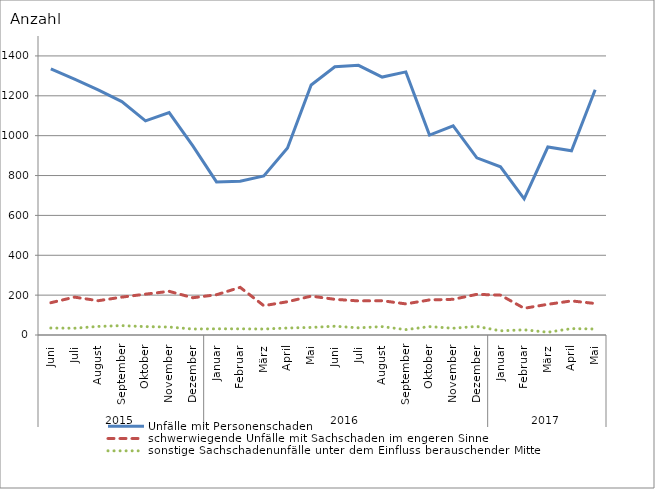
| Category | Unfälle mit Personenschaden | schwerwiegende Unfälle mit Sachschaden im engeren Sinne | sonstige Sachschadenunfälle unter dem Einfluss berauschender Mittel |
|---|---|---|---|
| 0 | 1335 | 162 | 35 |
| 1 | 1284 | 190 | 34 |
| 2 | 1230 | 172 | 43 |
| 3 | 1171 | 190 | 47 |
| 4 | 1074 | 205 | 42 |
| 5 | 1116 | 219 | 40 |
| 6 | 949 | 187 | 30 |
| 7 | 768 | 202 | 31 |
| 8 | 771 | 239 | 31 |
| 9 | 798 | 147 | 30 |
| 10 | 938 | 167 | 35 |
| 11 | 1254 | 195 | 38 |
| 12 | 1346 | 179 | 44 |
| 13 | 1353 | 171 | 36 |
| 14 | 1294 | 172 | 42 |
| 15 | 1320 | 156 | 27 |
| 16 | 1003 | 176 | 42 |
| 17 | 1049 | 179 | 34 |
| 18 | 889 | 204 | 43 |
| 19 | 844 | 200 | 21 |
| 20 | 683 | 134 | 26 |
| 21 | 943 | 154 | 14 |
| 22 | 924 | 171 | 32 |
| 23 | 1230 | 158 | 30 |